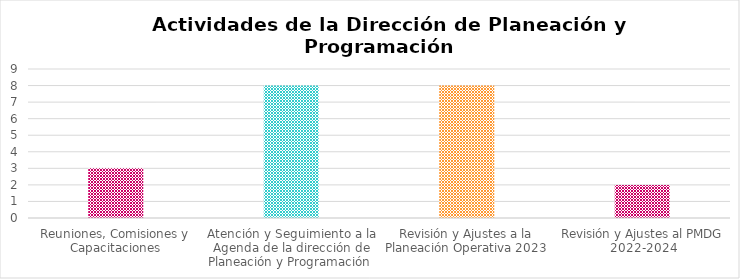
| Category | Series 0 |
|---|---|
| Reuniones, Comisiones y Capacitaciones | 3 |
| Atención y Seguimiento a la Agenda de la dirección de Planeación y Programación  | 8 |
| Revisión y Ajustes a la Planeación Operativa 2023 | 8 |
| Revisión y Ajustes al PMDG 2022-2024 | 2 |